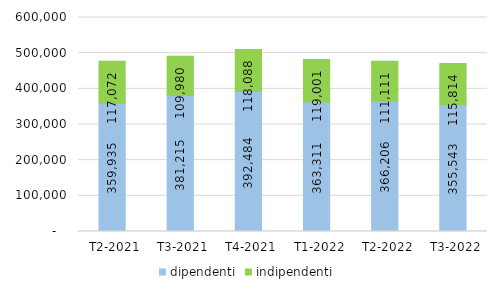
| Category | dipendenti | indipendenti |
|---|---|---|
|   T2-2021 | 359935 | 117072 |
|   T3-2021 | 381215 | 109980 |
|   T4-2021 | 392484 | 118088 |
|   T1-2022 | 363311 | 119001 |
|   T2-2022 | 366206 | 111111 |
|   T3-2022 | 355543 | 115814 |